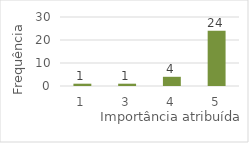
| Category | Series 0 |
|---|---|
| 1.0 | 1 |
| 3.0 | 1 |
| 4.0 | 4 |
| 5.0 | 24 |